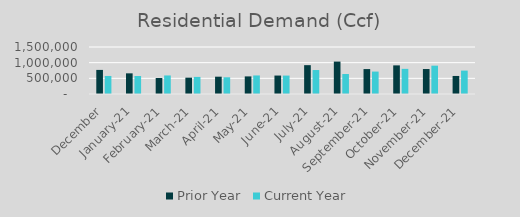
| Category | Prior Year | Current Year |
|---|---|---|
| December | 768795.205 | 575698.992 |
| January-21 | 659359.876 | 574964.407 |
| February-21 | 510296.309 | 591912.627 |
| March-21 | 521598.856 | 545392.69 |
| April-21 | 552550.404 | 533967.423 |
| May-21 | 561680.927 | 591911.753 |
| June-21 | 588815.728 | 587861.265 |
| July-21 | 920418.723 | 764849.567 |
| August-21 | 1034271.241 | 637451.79 |
| September-21 | 795392.365 | 715703.433 |
| October-21 | 913450.318 | 802383.882 |
| November-21 | 796803.85 | 904247.352 |
| December-21 | 575698.992 | 746791.488 |